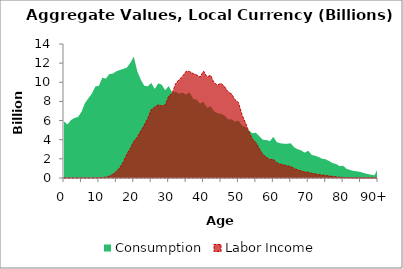
| Category | Consumption | Labor Income |
|---|---|---|
| 0 | 5893.663 | 0 |
|  | 5593.151 | 0 |
| 2 | 6055.301 | 0 |
| 3 | 6273.406 | 0 |
| 4 | 6372.029 | 0 |
| 5 | 6907.15 | 0 |
| 6 | 7816.092 | 0.194 |
| 7 | 8336.239 | 0.602 |
| 8 | 8820.333 | 2.641 |
| 9 | 9558.684 | 9.849 |
| 10 | 9639.332 | 19.842 |
| 11 | 10483.154 | 39.863 |
| 12 | 10383.582 | 89.707 |
| 13 | 10857.39 | 195.996 |
| 14 | 10904.453 | 390.28 |
| 15 | 11149.422 | 680.09 |
| 16 | 11287.707 | 1090.302 |
| 17 | 11399.091 | 1658.889 |
| 18 | 11527.413 | 2471.22 |
| 19 | 12024.434 | 3077.615 |
| 20 | 12683.661 | 3806.206 |
| 21 | 11160.037 | 4271.64 |
| 22 | 10287.711 | 4906.696 |
| 23 | 9641.858 | 5520.63 |
| 24 | 9582.89 | 6188.64 |
| 25 | 9938.196 | 7133.906 |
| 26 | 9306.078 | 7403.48 |
| 27 | 9893.462 | 7650.566 |
| 28 | 9749.682 | 7528.727 |
| 29 | 9175.779 | 7628.003 |
| 30 | 9608.955 | 8536.812 |
| 31 | 8941.787 | 8838.13 |
| 32 | 9022.955 | 9850.513 |
| 33 | 8823.057 | 10271.873 |
| 34 | 8912.488 | 10632.693 |
| 35 | 8717.433 | 11149.623 |
| 36 | 8947.391 | 11130.294 |
| 37 | 8271.632 | 10910.318 |
| 38 | 8178.016 | 10788.09 |
| 39 | 7768.851 | 10537.991 |
| 40 | 7954.66 | 11170.722 |
| 41 | 7343.421 | 10558.165 |
| 42 | 7501.491 | 10733.141 |
| 43 | 6987.506 | 9941.511 |
| 44 | 6760.022 | 9714.905 |
| 45 | 6708.074 | 9883.064 |
| 46 | 6525.583 | 9549.141 |
| 47 | 6142.316 | 9018.953 |
| 48 | 6151.64 | 8786.039 |
| 49 | 5888.769 | 8191.966 |
| 50 | 6000.919 | 7885.803 |
| 51 | 5489.861 | 6633.794 |
| 52 | 5329.636 | 5775.343 |
| 53 | 4968.73 | 4835.373 |
| 54 | 4674.464 | 4079.211 |
| 55 | 4736.57 | 3706.66 |
| 56 | 4371.585 | 3048.817 |
| 57 | 3984.411 | 2448.119 |
| 58 | 3980.813 | 2177.078 |
| 59 | 3838.676 | 1909.14 |
| 60 | 4293.589 | 1948.91 |
| 61 | 3745.254 | 1591.741 |
| 62 | 3626.617 | 1448.029 |
| 63 | 3582.506 | 1362.886 |
| 64 | 3584.341 | 1267.672 |
| 65 | 3622.261 | 1190.559 |
| 66 | 3195.421 | 989.396 |
| 67 | 3007.217 | 849.186 |
| 68 | 2877.526 | 736.731 |
| 69 | 2648.533 | 621.136 |
| 70 | 2847.717 | 607.446 |
| 71 | 2413.002 | 479.689 |
| 72 | 2323.379 | 428.268 |
| 73 | 2195.49 | 368.538 |
| 74 | 2004.901 | 302.439 |
| 75 | 1957.629 | 265.745 |
| 76 | 1770.077 | 209.941 |
| 77 | 1559.457 | 155.968 |
| 78 | 1466.111 | 119.054 |
| 79 | 1235.167 | 78.469 |
| 80 | 1287.702 | 62.682 |
| 81 | 951.617 | 37.395 |
| 82 | 842.501 | 27.055 |
| 83 | 734.792 | 18.632 |
| 84 | 692.039 | 13.313 |
| 85 | 624.219 | 10.596 |
| 86 | 512.412 | 6.686 |
| 87 | 416.818 | 3.56 |
| 88 | 344.384 | 2.398 |
| 89 | 279.299 | 1.692 |
| 90+ | 1018.204 | 19.062 |